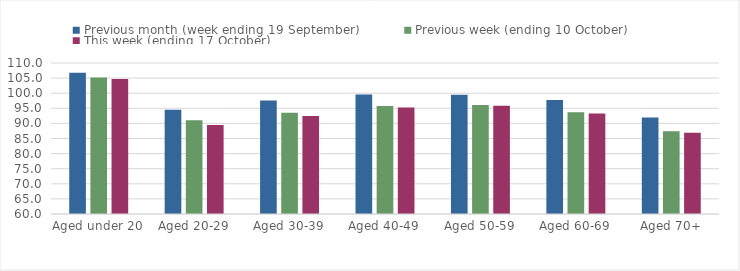
| Category | Previous month (week ending 19 September) | Previous week (ending 10 October) | This week (ending 17 October) |
|---|---|---|---|
| Aged under 20 | 106.74 | 105.24 | 104.71 |
| Aged 20-29 | 94.55 | 91.01 | 89.48 |
| Aged 30-39 | 97.55 | 93.52 | 92.49 |
| Aged 40-49 | 99.61 | 95.77 | 95.25 |
| Aged 50-59 | 99.48 | 96.06 | 95.84 |
| Aged 60-69 | 97.74 | 93.67 | 93.27 |
| Aged 70+ | 91.99 | 87.38 | 86.89 |